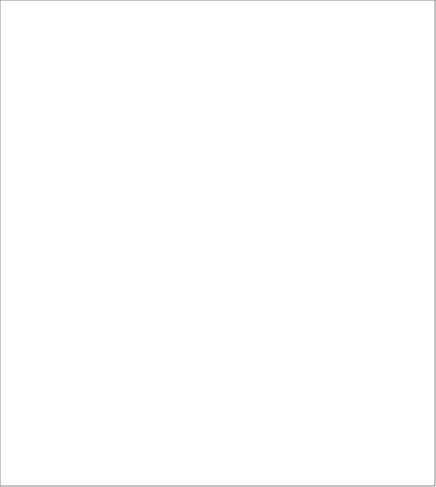
| Category | Series 0 |
|---|---|
| WBRI | 0 |
| WCOR | 0 |
| WENG | 0 |
| WSCO | 0 |
| WWEL | 0 |
| WOWB | 0 |
| WIRI | 0 |
| WIRT | 0 |
| WOTH | 0 |
| WALB | 0 |
| WBOS | 0 |
| WCRO | 0 |
| WGRE | 0 |
| WGRK | 0 |
| WGRC | 0 |
| WITA | 0 |
| WKOS | 0 |
| WPOR | 0 |
| WSER | 0 |
| WTUR | 0 |
| WTUK | 0 |
| WTUC | 0 |
| WEUR | 0 |
| WEEU | 0 |
| WWEU | 0 |
| WOTW | 0 |
| WROM | 0 |
| WROG | 0 |
| WROR | 0 |
| WROO | 0 |
| MWBC | 0 |
| MWBA | 0 |
| MWAS | 0 |
| MWAP | 0 |
| MWAI | 0 |
| MWAO | 0 |
| MOTH | 0 |
| MAOE | 0 |
| MABL | 0 |
| MACH | 0 |
| MBOE | 0 |
| MBCH | 0 |
| MCOE | 0 |
| MWOE | 0 |
| MWCH | 0 |
| MOTM | 0 |
| AIND | 0 |
| APKN | 0 |
| AMPK | 0 |
| AKPA | 0 |
| AOPK | 0 |
| ABAN | 0 |
| AOTH | 0 |
| AAFR | 0 |
| AKAO | 0 |
| ANEP | 0 |
| ASNL | 0 |
| ASLT | 0 |
| ASRO | 0 |
| AOTA | 0 |
| BCRB | 0 |
| BAFR | 0 |
| BANN | 0 |
| BCON | 0 |
| BGHA | 0 |
| BNGN | 0 |
| BSLN | 0 |
| BSOM | 0 |
| BSUD | 0 |
| BAOF | 0 |
| BOTH | 0 |
| BEUR | 0 |
| BNAM | 0 |
| BOTB | 0 |
| CHNE | 0 |
| CHKC | 0 |
| CMAL | 0 |
| CSNG | 0 |
| CTWN | 0 |
| COCH | 0 |
| OOTH | 0 |
| OAFG | 0 |
| OARA | 0 |
| OEGY | 0 |
| OFIL | 0 |
| OIRN | 0 |
| OIRQ | 0 |
| OJPN | 0 |
| OKOR | 0 |
| OKRD | 0 |
| OLAM | 0 |
| OLEB | 0 |
| OLIB | 0 |
| OMAL | 0 |
| OMRC | 0 |
| OPOL | 0 |
| OTHA | 0 |
| OVIE | 0 |
| OYEM | 0 |
| OOEG | 0 |
| REFU | 0 |
| NOBT | 0 |